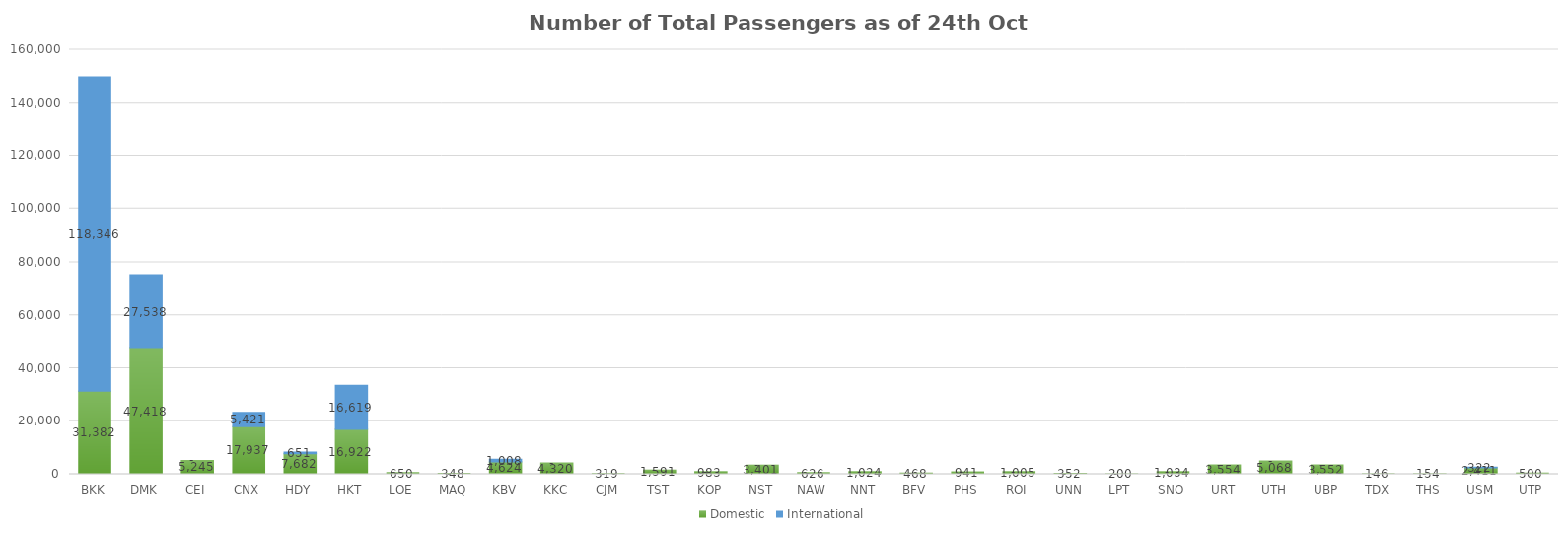
| Category | Domestic | International |
|---|---|---|
| BKK | 31382 | 118346 |
| DMK | 47418 | 27538 |
| CEI | 5245 | 0 |
| CNX | 17937 | 5421 |
| HDY | 7682 | 651 |
| HKT | 16922 | 16619 |
| LOE | 650 | 0 |
| MAQ | 348 | 0 |
| KBV | 4624 | 1008 |
| KKC | 4320 | 0 |
| CJM | 319 | 0 |
| TST | 1591 | 0 |
| KOP | 983 | 0 |
| NST | 3401 | 0 |
| NAW | 626 | 0 |
| NNT | 1024 | 0 |
| BFV | 468 | 0 |
| PHS | 941 | 0 |
| ROI | 1005 | 0 |
| UNN | 352 | 0 |
| LPT | 200 | 0 |
| SNO | 1034 | 0 |
| URT | 3554 | 0 |
| UTH | 5068 | 0 |
| UBP | 3552 | 0 |
| TDX | 146 | 0 |
| THS | 154 | 0 |
| USM | 2411 | 322 |
| UTP | 500 | 0 |